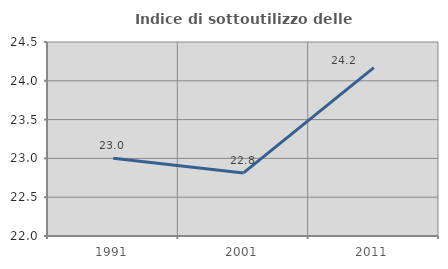
| Category | Indice di sottoutilizzo delle abitazioni  |
|---|---|
| 1991.0 | 23.001 |
| 2001.0 | 22.813 |
| 2011.0 | 24.17 |